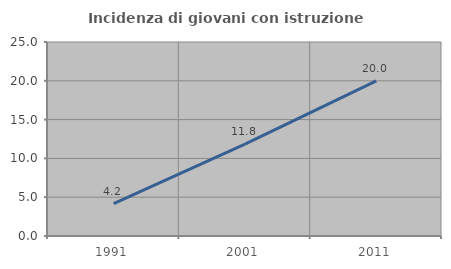
| Category | Incidenza di giovani con istruzione universitaria |
|---|---|
| 1991.0 | 4.167 |
| 2001.0 | 11.828 |
| 2011.0 | 20 |